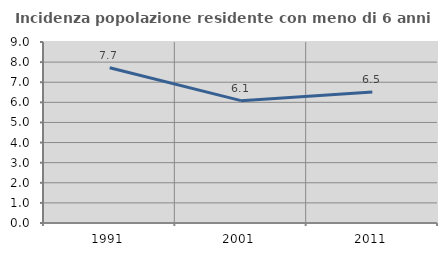
| Category | Incidenza popolazione residente con meno di 6 anni |
|---|---|
| 1991.0 | 7.723 |
| 2001.0 | 6.083 |
| 2011.0 | 6.512 |